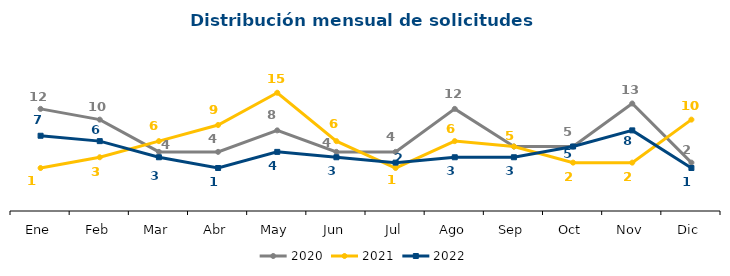
| Category | 2020 | 2021 | 2022 |
|---|---|---|---|
| Ene | 12 | 1 | 7 |
| Feb | 10 | 3 | 6 |
| Mar | 4 | 6 | 3 |
| Abr | 4 | 9 | 1 |
| May | 8 | 15 | 4 |
| Jun | 4 | 6 | 3 |
| Jul | 4 | 1 | 2 |
| Ago | 12 | 6 | 3 |
| Sep | 5 | 5 | 3 |
| Oct | 5 | 2 | 5 |
| Nov | 13 | 2 | 8 |
| Dic | 2 | 10 | 1 |